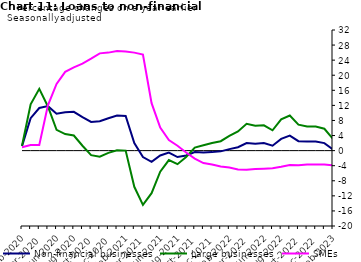
| Category | zero | Non-financial businesses | Large businesses | SMEs |
|---|---|---|---|---|
| Feb-2020 | 0 | 1.2 | 1.3 | 0.9 |
| Mar-2020 | 0 | 8.6 | 12.3 | 1.5 |
| Apr-2020 | 0 | 11.3 | 16.4 | 1.5 |
| May-2020 | 0 | 11.8 | 11.7 | 12 |
| Jun-2020 | 0 | 9.8 | 5.5 | 17.7 |
| Jul-2020 | 0 | 10.2 | 4.4 | 20.9 |
| Aug-2020 | 0 | 10.3 | 4 | 22.1 |
| Sep-2020 | 0 | 8.9 | 1.3 | 23.1 |
| Oct-2020 | 0 | 7.6 | -1.2 | 24.4 |
| Nov-2020 | 0 | 7.8 | -1.6 | 25.8 |
| Dec-2020 | 0 | 8.6 | -0.6 | 26 |
| Jan-2021 | 0 | 9.3 | 0.1 | 26.4 |
| Feb-2021 | 0 | 9.2 | 0 | 26.3 |
| Mar-2021 | 0 | 2 | -9.6 | 26 |
| Apr-2021 | 0 | -1.7 | -14.4 | 25.5 |
| May-2021 | 0 | -3 | -11.3 | 12.6 |
| Jun-2021 | 0 | -1.3 | -5.6 | 6.1 |
| Jul-2021 | 0 | -0.5 | -2.5 | 2.8 |
| Aug-2021 | 0 | -1.7 | -3.6 | 1.3 |
| Sep-2021 | 0 | -1.3 | -1.7 | -0.5 |
| Oct-2021 | 0 | -0.4 | 0.8 | -2.1 |
| Nov-2021 | 0 | -0.5 | 1.4 | -3.3 |
| Dec-2021 | 0 | -0.4 | 2 | -3.7 |
| Jan-2022 | 0 | -0.2 | 2.5 | -4.2 |
| Feb-2022 | 0 | 0.4 | 3.9 | -4.5 |
| Mar-2022 | 0 | 0.9 | 5.1 | -5 |
| Apr-2022 | 0 | 2 | 7.1 | -5.1 |
| May-2022 | 0 | 1.8 | 6.6 | -4.9 |
| Jun-2022 | 0 | 2 | 6.7 | -4.8 |
| Jul-2022 | 0 | 1.3 | 5.4 | -4.7 |
| Aug-2022 | 0 | 3.1 | 8.3 | -4.3 |
| Sep-2022 | 0 | 4 | 9.3 | -3.8 |
| Oct-2022 | 0 | 2.5 | 6.9 | -3.9 |
| Nov-2022 | 0 | 2.4 | 6.4 | -3.7 |
| Dec-2022 | 0 | 2.4 | 6.4 | -3.7 |
| Jan-2023 | 0 | 2 | 5.8 | -3.7 |
| Feb-2023 | 0 | 0.3 | 3.1 | -3.9 |